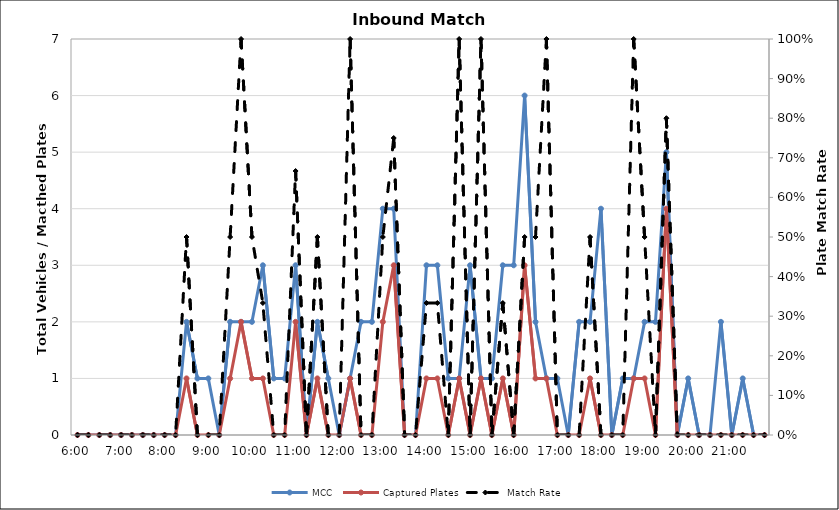
| Category | MCC | Captured Plates |
|---|---|---|
| 0.25 | 0 | 0 |
| 0.260416666666667 | 0 | 0 |
| 0.270833333333333 | 0 | 0 |
| 0.28125 | 0 | 0 |
| 0.291666666666667 | 0 | 0 |
| 0.302083333333333 | 0 | 0 |
| 0.3125 | 0 | 0 |
| 0.322916666666667 | 0 | 0 |
| 0.333333333333333 | 0 | 0 |
| 0.34375 | 0 | 0 |
| 0.354166666666667 | 2 | 1 |
| 0.364583333333333 | 1 | 0 |
| 0.375 | 1 | 0 |
| 0.385416666666667 | 0 | 0 |
| 0.395833333333333 | 2 | 1 |
| 0.40625 | 2 | 2 |
| 0.416666666666667 | 2 | 1 |
| 0.427083333333333 | 3 | 1 |
| 0.4375 | 1 | 0 |
| 0.447916666666667 | 1 | 0 |
| 0.458333333333333 | 3 | 2 |
| 0.46875 | 0 | 0 |
| 0.479166666666667 | 2 | 1 |
| 0.489583333333333 | 1 | 0 |
| 0.5 | 0 | 0 |
| 0.510416666666667 | 1 | 1 |
| 0.520833333333333 | 2 | 0 |
| 0.53125 | 2 | 0 |
| 0.541666666666667 | 4 | 2 |
| 0.552083333333333 | 4 | 3 |
| 0.5625 | 0 | 0 |
| 0.572916666666667 | 0 | 0 |
| 0.583333333333333 | 3 | 1 |
| 0.59375 | 3 | 1 |
| 0.604166666666667 | 1 | 0 |
| 0.614583333333333 | 1 | 1 |
| 0.625 | 3 | 0 |
| 0.635416666666667 | 1 | 1 |
| 0.645833333333333 | 1 | 0 |
| 0.65625 | 3 | 1 |
| 0.666666666666667 | 3 | 0 |
| 0.677083333333333 | 6 | 3 |
| 0.6875 | 2 | 1 |
| 0.697916666666667 | 1 | 1 |
| 0.708333333333333 | 1 | 0 |
| 0.71875 | 0 | 0 |
| 0.729166666666667 | 2 | 0 |
| 0.739583333333333 | 2 | 1 |
| 0.75 | 4 | 0 |
| 0.760416666666667 | 0 | 0 |
| 0.770833333333333 | 1 | 0 |
| 0.78125 | 1 | 1 |
| 0.791666666666667 | 2 | 1 |
| 0.802083333333333 | 2 | 0 |
| 0.8125 | 5 | 4 |
| 0.822916666666667 | 0 | 0 |
| 0.833333333333333 | 1 | 0 |
| 0.84375 | 0 | 0 |
| 0.854166666666667 | 0 | 0 |
| 0.864583333333333 | 2 | 0 |
| 0.875 | 0 | 0 |
| 0.885416666666667 | 1 | 0 |
| 0.895833333333333 | 0 | 0 |
| 0.90625 | 0 | 0 |